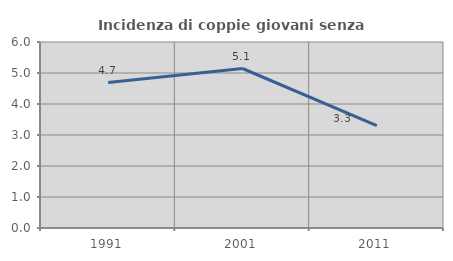
| Category | Incidenza di coppie giovani senza figli |
|---|---|
| 1991.0 | 4.692 |
| 2001.0 | 5.145 |
| 2011.0 | 3.304 |